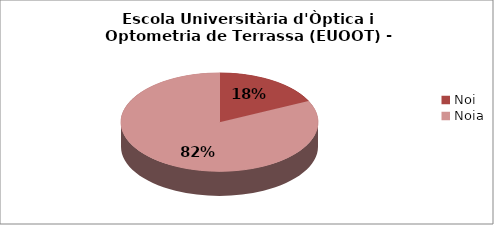
| Category | Escola Universitària d'Òptica i Optometria de Terrassa (EUOOT) - Gènere |
|---|---|
| Noi | 0.179 |
| Noia | 0.821 |